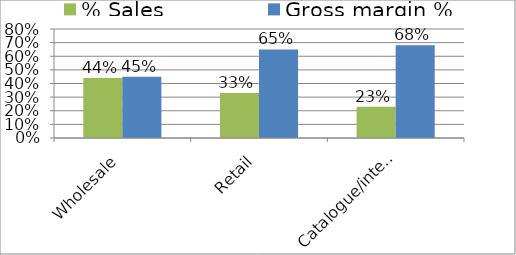
| Category | % Sales | Gross margin % |
|---|---|---|
| Wholesale | 0.44 | 0.45 |
| Retail | 0.33 | 0.65 |
| Catalogue/internet | 0.23 | 0.68 |